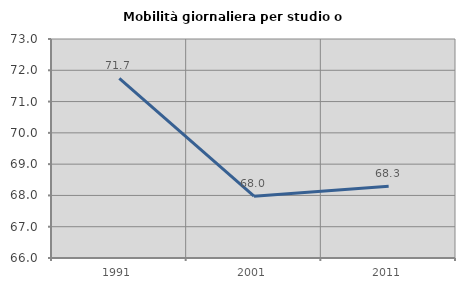
| Category | Mobilità giornaliera per studio o lavoro |
|---|---|
| 1991.0 | 71.745 |
| 2001.0 | 67.974 |
| 2011.0 | 68.293 |